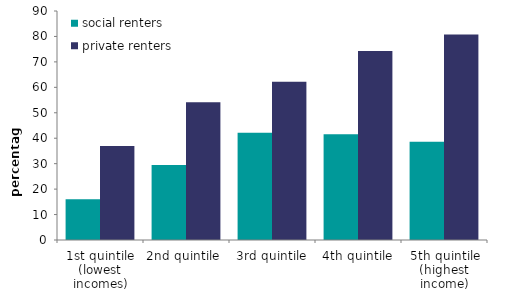
| Category | social renters | private renters |
|---|---|---|
| 1st quintile (lowest incomes) | 15.991 | 36.951 |
| 2nd quintile  | 29.434 | 54.172 |
| 3rd quintile | 42.137 | 62.235 |
| 4th quintile | 41.602 | 74.282 |
| 5th quintile (highest income) | 38.66 | 80.717 |